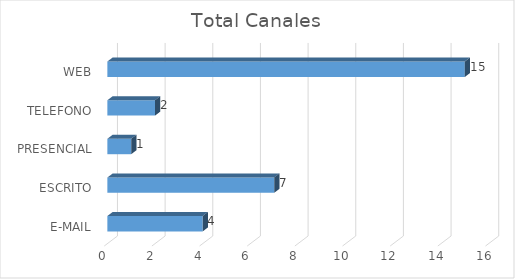
| Category | Total |
|---|---|
| E-MAIL | 4 |
| ESCRITO | 7 |
| PRESENCIAL | 1 |
| TELEFONO | 2 |
| WEB | 15 |